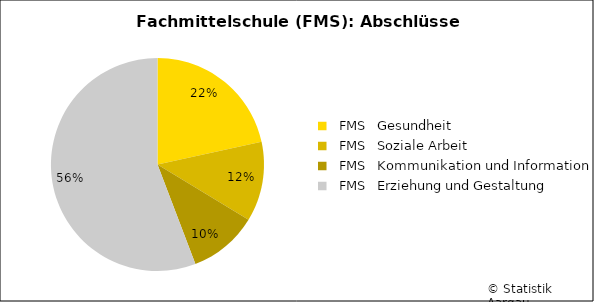
| Category | Series 0 |
|---|---|
|   FMS   Gesundheit | 41 |
|   FMS   Soziale Arbeit | 23 |
|   FMS   Kommunikation und Information | 20 |
|   FMS   Erziehung und Gestaltung | 106 |